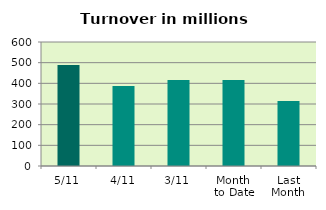
| Category | Series 0 |
|---|---|
| 5/11 | 488.897 |
| 4/11 | 387.457 |
| 3/11 | 415.669 |
| Month 
to Date | 416.256 |
| Last
Month | 314.143 |